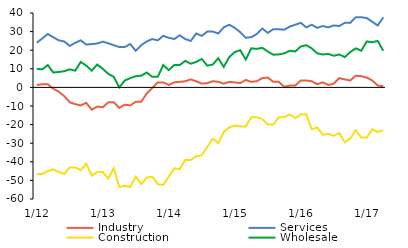
| Category | Industry | Services | Construction | Wholesale |
|---|---|---|---|---|
|  1/12 | 1.3 | 24 | -46.5 | 10 |
| 2 | 1.7 | 26.3 | -46.5 | 9.7 |
| 3 | 1.7 | 28.7 | -45 | 12 |
| 4 | -0.7 | 27 | -44 | 8 |
| 5 | -2.3 | 25.3 | -45.5 | 8.3 |
| 6 | -4.7 | 24.7 | -46.5 | 8.7 |
| 7 | -8 | 22.3 | -43 | 9.7 |
| 8 | -9 | 24 | -43 | 9 |
| 9 | -9.7 | 25.3 | -44.5 | 13.7 |
| 10 | -8.3 | 23 | -41 | 11.7 |
| 11 | -12 | 23.3 | -47.5 | 9 |
| 12 | -10.3 | 23.6 | -45.5 | 12.3 |
|  1/13 | -10.7 | 24.6 | -45.5 | 10 |
| 2 | -8 | 23.7 | -49 | 7.3 |
| 3 | -8 | 22.7 | -43.5 | 5.7 |
| 4 | -11 | 21.7 | -53.5 | 0 |
| 5 | -9.3 | 21.7 | -53 | 3.7 |
| 6 | -9.7 | 23.3 | -53.5 | 5 |
| 7 | -7.7 | 19.7 | -48 | 6 |
| 8 | -7.7 | 22.7 | -52 | 6.3 |
| 9 | -3.3 | 24.7 | -48.5 | 8 |
| 10 | -0.3 | 26 | -48 | 5.7 |
| 11 | 2.7 | 25.3 | -52 | 5.7 |
| 12 | 2.7 | 27.7 | -52.5 | 12 |
|  1/14 | 1.3 | 26.7 | -48 | 9.3 |
|  2 | 2.7 | 26 | -43.5 | 12 |
| 3 | 3 | 28 | -44 | 12 |
| 4 | 3.3 | 26 | -39 | 14.3 |
| 5 | 4.3 | 25 | -39 | 12.7 |
| 6 | 3.3 | 29 | -37 | 13.7 |
| 7 | 2 | 27.7 | -36.5 | 15.3 |
| 8 | 2.3 | 30 | -32 | 11.7 |
| 9 | 3.3 | 30 | -27.5 | 12.3 |
| 10 | 3 | 29 | -30 | 15.7 |
| 11 | 2 | 32.3 | -24 | 11 |
| 12 | 3 | 33.7 | -21.5 | 16.3 |
|  1/15 | 2.7 | 32 | -20.5 | 19 |
| 2 | 2.3 | 29.7 | -21 | 20 |
| 3 | 4 | 26.7 | -21 | 15 |
| 4 | 3 | 27 | -16 | 21 |
| 5 | 3.3 | 28.7 | -16 | 20.7 |
| 6 | 5 | 31.7 | -17 | 21.3 |
| 7 | 5.3 | 29.3 | -20 | 19.3 |
| 8 | 3 | 31.3 | -20 | 17.6 |
| 9 | 3 | 31.3 | -16 | 17.7 |
| 10 | 0.3 | 31 | -16 | 18.3 |
| 11 | 1 | 32.7 | -14.5 | 19.7 |
| 12 | 1 | 33.7 | -16.5 | 19.3 |
|  1/16 | 3.7 | 34.7 | -14.5 | 22 |
| 2 | 3.7 | 32.3 | -14.5 | 22.7 |
| 3 | 3.3 | 33.7 | -22.5 | 21 |
| 4 | 1.7 | 32 | -21.5 | 18.3 |
| 5 | 2.7 | 33 | -25.5 | 17.7 |
| 6 | 1.3 | 32.3 | -25 | 18 |
| 7 | 2 | 33.3 | -26 | 17 |
| 8 | 5 | 33 | -24.5 | 17.7 |
| 9 | 4.3 | 34.7 | -29.5 | 16.3 |
| 10 | 3.7 | 34.7 | -27.5 | 19 |
| 11 | 6.3 | 37.7 | -23 | 21 |
| 12 | 6 | 37.7 | -27 | 19.7 |
|  1/17 | 5.3 | 37.3 | -27 | 24.7 |
| 2 | 3.7 | 35.3 | -22.5 | 24.3 |
| 3 | 1 | 33.3 | -24 | 25 |
| 4 | 0.7 | 37.7 | -23 | 19.7 |